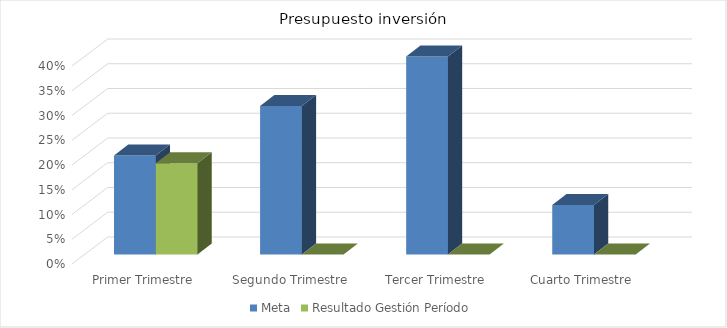
| Category | Meta | Resultado Gestión Período |
|---|---|---|
| Primer Trimestre | 0.2 | 0.184 |
| Segundo Trimestre | 0.3 | 0 |
| Tercer Trimestre | 0.4 | 0 |
| Cuarto Trimestre | 0.1 | 0 |